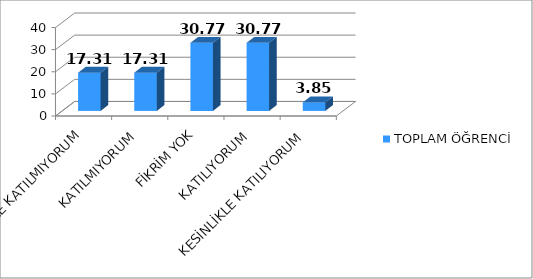
| Category | TOPLAM ÖĞRENCİ |
|---|---|
| KESİNLİKLE KATILMIYORUM | 17.31 |
| KATILMIYORUM | 17.31 |
| FİKRİM YOK | 30.77 |
| KATILIYORUM | 30.77 |
| KESİNLİKLE KATILIYORUM | 3.85 |